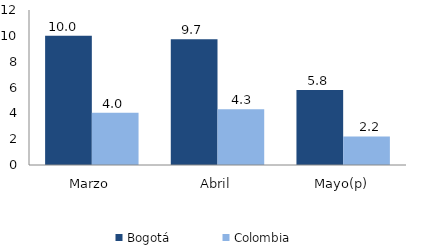
| Category | Bogotá | Colombia |
|---|---|---|
| Marzo | 10.007 | 4.046 |
| Abril | 9.735 | 4.323 |
| Mayo(p) | 5.815 | 2.215 |